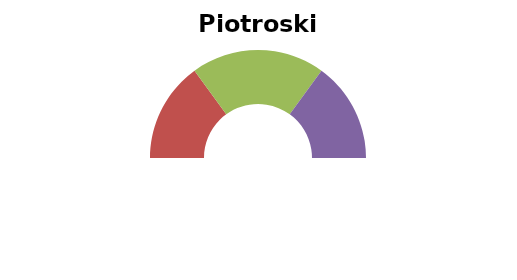
| Category | Piotroski Score |
|---|---|
| 0 | 0 |
| 1 | 30 |
| 2 | 40 |
| 3 | 30 |
| 4 | 100 |